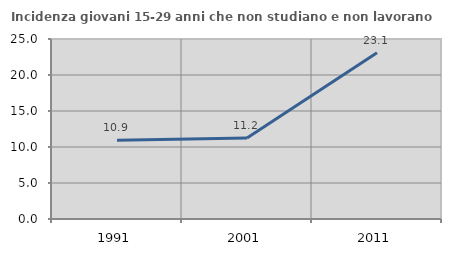
| Category | Incidenza giovani 15-29 anni che non studiano e non lavorano  |
|---|---|
| 1991.0 | 10.938 |
| 2001.0 | 11.236 |
| 2011.0 | 23.077 |